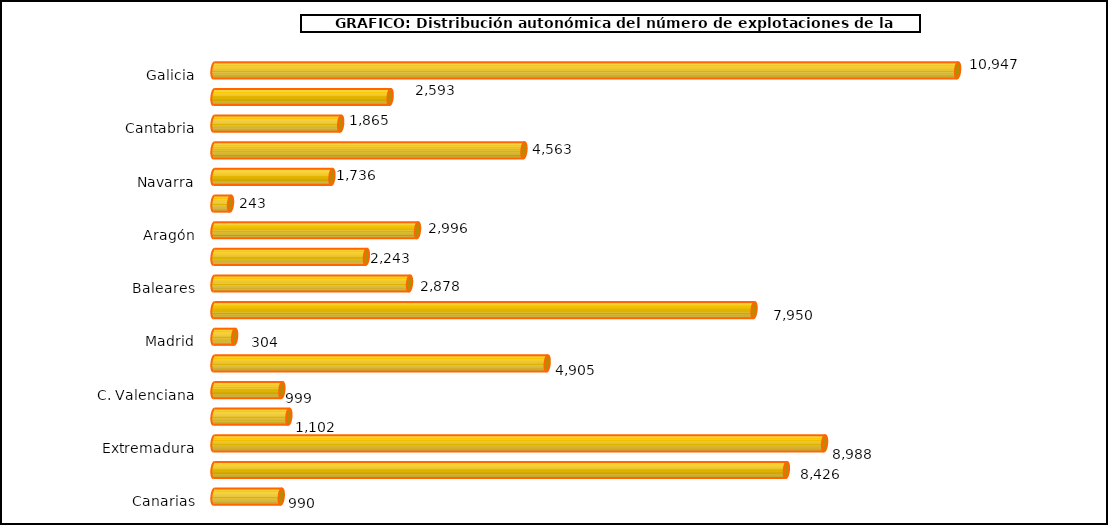
| Category | num. Explotaciones |
|---|---|
| 0 | 10947 |
| 1 | 2593 |
| 2 | 1865 |
| 3 | 4563 |
| 4 | 1736 |
| 5 | 243 |
| 6 | 2996 |
| 7 | 2243 |
| 8 | 2878 |
| 9 | 7950 |
| 10 | 304 |
| 11 | 4905 |
| 12 | 999 |
| 13 | 1102 |
| 14 | 8988 |
| 15 | 8426 |
| 16 | 990 |